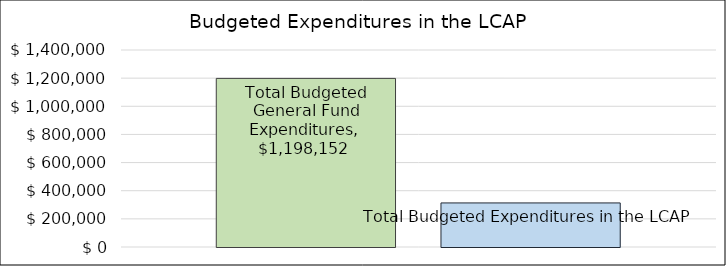
| Category | Total Budgeted General Fund Expenditures | Total Budgeted Expenditures in the LCAP |
|---|---|---|
| 0 | 1198152 | 313141 |